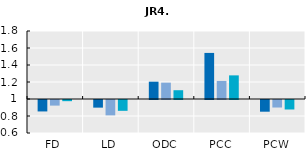
| Category | 2005 | 2010 | 2015 |
|---|---|---|---|
| FD | 0.865 | 0.934 | 0.986 |
| LD | 0.91 | 0.819 | 0.873 |
| ODC | 1.204 | 1.192 | 1.103 |
| PCC | 1.542 | 1.212 | 1.278 |
| PCW | 0.862 | 0.911 | 0.888 |